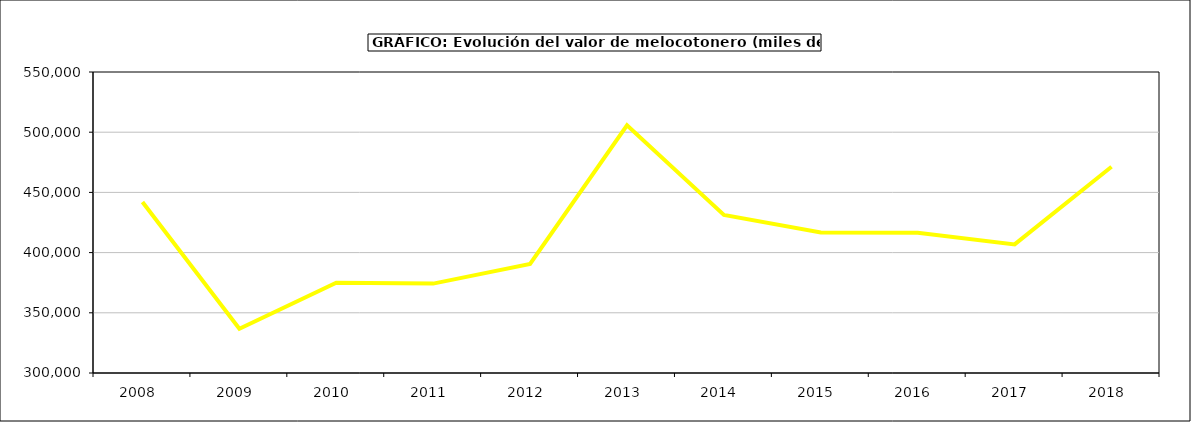
| Category | valor melocotonero |
|---|---|
| 2008.0 | 442040.134 |
| 2009.0 | 336769.335 |
| 2010.0 | 374959.034 |
| 2011.0 | 374235.162 |
| 2012.0 | 390522.664 |
| 2013.0 | 505779.721 |
| 2014.0 | 431268.365 |
| 2015.0 | 416638 |
| 2016.0 | 416500 |
| 2017.0 | 406839.379 |
| 2018.0 | 471336.394 |